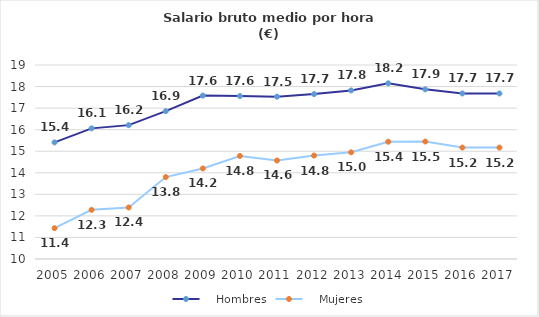
| Category |    Hombres |    Mujeres |
|---|---|---|
| 2005.0 | 15.41 | 11.43 |
| 2006.0 | 16.06 | 12.28 |
| 2007.0 | 16.21 | 12.39 |
| 2008.0 | 16.86 | 13.8 |
| 2009.0 | 17.58 | 14.2 |
| 2010.0 | 17.56 | 14.78 |
| 2011.0 | 17.53 | 14.57 |
| 2012.0 | 17.65 | 14.8 |
| 2013.0 | 17.82 | 14.95 |
| 2014.0 | 18.15 | 15.44 |
| 2015.0 | 17.87 | 15.45 |
| 2016.0 | 17.68 | 15.17 |
| 2017.0 | 17.68 | 15.17 |